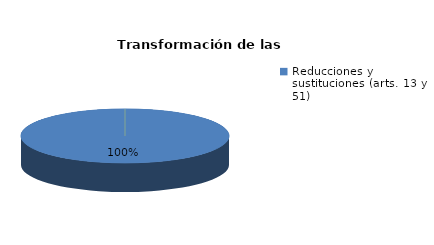
| Category | Series 0 |
|---|---|
| Reducciones y sustituciones (arts. 13 y 51) | 29 |
| Por quebrantamiento (art. 50.2) | 0 |
| Cancelaciones anticipadas | 0 |
| Traslado a Centros Penitenciarios | 0 |
| Conversión internamientos en cerrados (art. 51.2) | 0 |